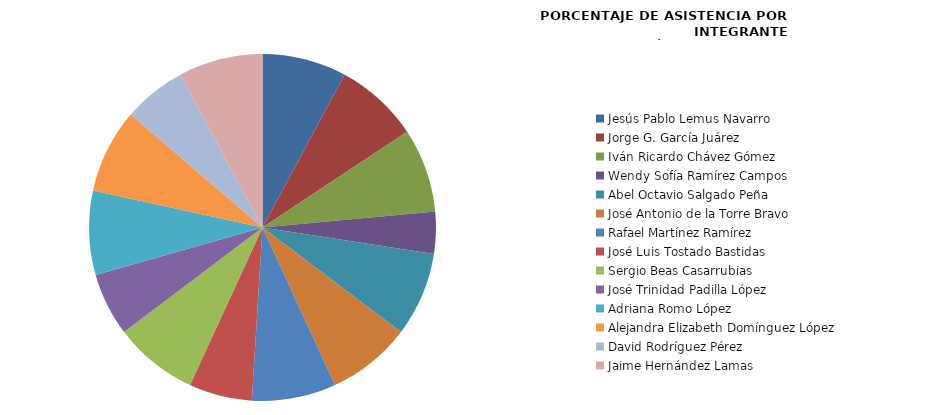
| Category | Series 0 |
|---|---|
| Jesús Pablo Lemus Navarro | 100 |
| Jorge G. García Juárez | 100 |
| Iván Ricardo Chávez Gómez | 100 |
| Wendy Sofía Ramírez Campos | 50 |
| Abel Octavio Salgado Peña | 100 |
| José Antonio de la Torre Bravo | 100 |
| Rafael Martínez Ramírez | 100 |
| José Luis Tostado Bastidas | 75 |
| Sergio Beas Casarrubias | 100 |
| José Trinidad Padilla López | 75 |
| Adriana Romo López | 100 |
| Alejandra Elizabeth Domínguez López | 100 |
| David Rodríguez Pérez | 75 |
| Jaime Hernández Lamas | 100 |